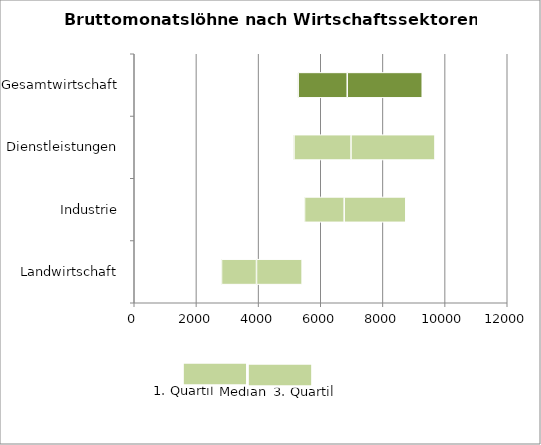
| Category | Q1 | M-Q1 | Q3-M |
|---|---|---|---|
| Landwirtschaft | 2807 | 1126 | 1468 |
| Industrie | 5478 | 1276 | 1982 |
| Dienstleistungen | 5138 | 1835 | 2702 |
| Gesamtwirtschaft | 5274 | 1578 | 2413 |